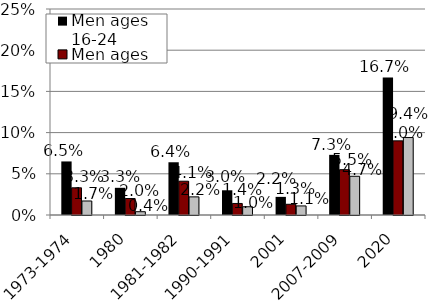
| Category | Men ages 16-24 | Men ages 25-54 | Men ages 55+ |
|---|---|---|---|
| 1973-1974 | 0.065 | 0.033 | 0.017 |
| 1980 | 0.033 | 0.02 | 0.004 |
| 1981-1982 | 0.064 | 0.041 | 0.022 |
| 1990-1991 | 0.03 | 0.014 | 0.01 |
| 2001 | 0.022 | 0.013 | 0.011 |
| 2007-2009 | 0.073 | 0.055 | 0.047 |
| 2020 | 0.167 | 0.09 | 0.094 |